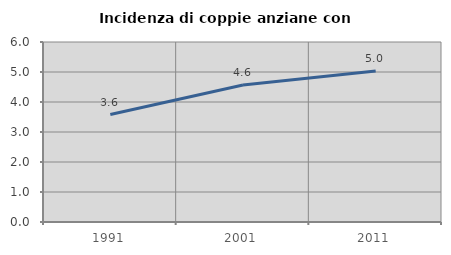
| Category | Incidenza di coppie anziane con figli |
|---|---|
| 1991.0 | 3.581 |
| 2001.0 | 4.567 |
| 2011.0 | 5.032 |